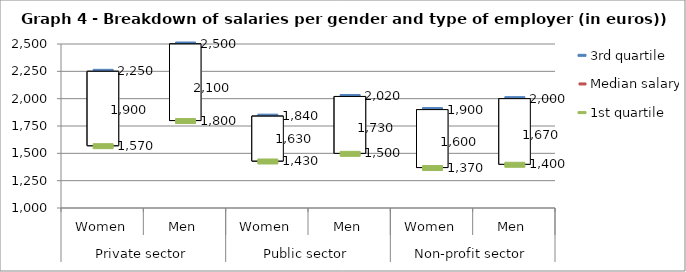
| Category | 3rd quartile | Median salary | 1st quartile |
|---|---|---|---|
| 0 | 2250 | 1900 | 1570 |
| 1 | 2500 | 2100 | 1800 |
| 2 | 1840 | 1630 | 1430 |
| 3 | 2020 | 1730 | 1500 |
| 4 | 1900 | 1600 | 1370 |
| 5 | 2000 | 1670 | 1400 |